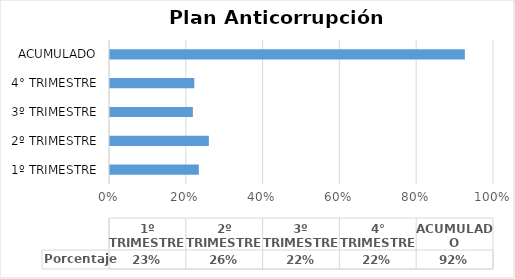
| Category | Porcentaje |
|---|---|
| 1º TRIMESTRE | 0.231 |
| 2º TRIMESTRE | 0.258 |
| 3º TRIMESTRE | 0.216 |
| 4° TRIMESTRE | 0.219 |
| ACUMULADO | 0.924 |